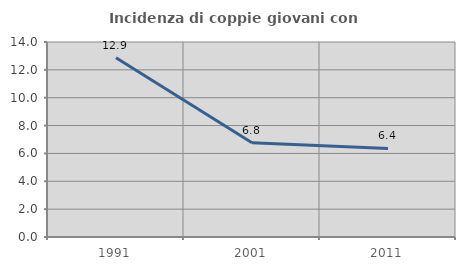
| Category | Incidenza di coppie giovani con figli |
|---|---|
| 1991.0 | 12.868 |
| 2001.0 | 6.773 |
| 2011.0 | 6.356 |